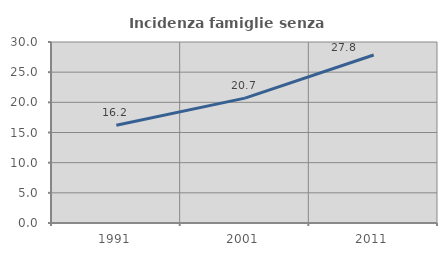
| Category | Incidenza famiglie senza nuclei |
|---|---|
| 1991.0 | 16.198 |
| 2001.0 | 20.695 |
| 2011.0 | 27.846 |